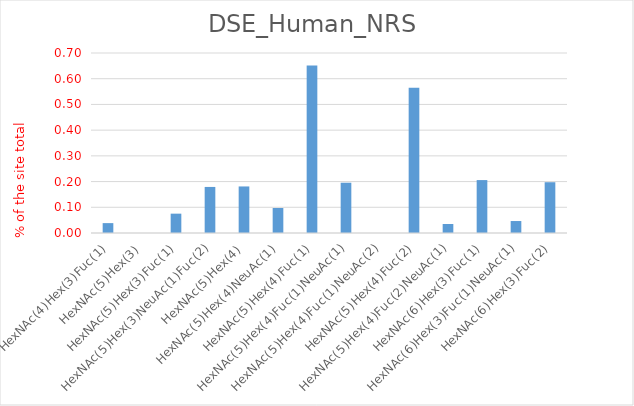
| Category | Series 0 |
|---|---|
| HexNAc(4)Hex(3)Fuc(1) | 0.038 |
| HexNAc(5)Hex(3) | 0 |
| HexNAc(5)Hex(3)Fuc(1) | 0.075 |
| HexNAc(5)Hex(3)NeuAc(1)Fuc(2) | 0.179 |
| HexNAc(5)Hex(4) | 0.181 |
| HexNAc(5)Hex(4)NeuAc(1) | 0.097 |
| HexNAc(5)Hex(4)Fuc(1) | 0.651 |
| HexNAc(5)Hex(4)Fuc(1)NeuAc(1) | 0.196 |
| HexNAc(5)Hex(4)Fuc(1)NeuAc(2) | 0 |
| HexNAc(5)Hex(4)Fuc(2) | 0.565 |
| HexNAc(5)Hex(4)Fuc(2)NeuAc(1) | 0.035 |
| HexNAc(6)Hex(3)Fuc(1) | 0.206 |
| HexNAc(6)Hex(3)Fuc(1)NeuAc(1) | 0.047 |
| HexNAc(6)Hex(3)Fuc(2) | 0.197 |